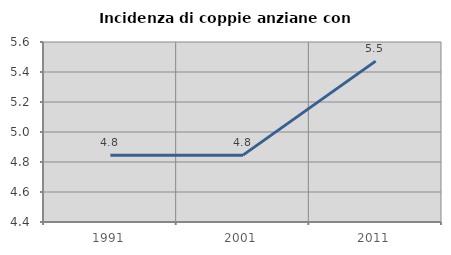
| Category | Incidenza di coppie anziane con figli |
|---|---|
| 1991.0 | 4.846 |
| 2001.0 | 4.846 |
| 2011.0 | 5.473 |